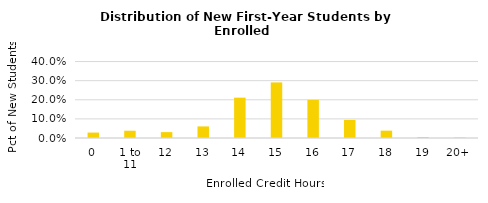
| Category | Series 0 |
|---|---|
| 0 | 0.028 |
| 1 to 11 | 0.038 |
| 12 | 0.031 |
| 13 | 0.061 |
| 14 | 0.211 |
| 15 | 0.291 |
| 16 | 0.199 |
| 17 | 0.095 |
| 18 | 0.038 |
| 19 | 0.005 |
| 20+ | 0.003 |